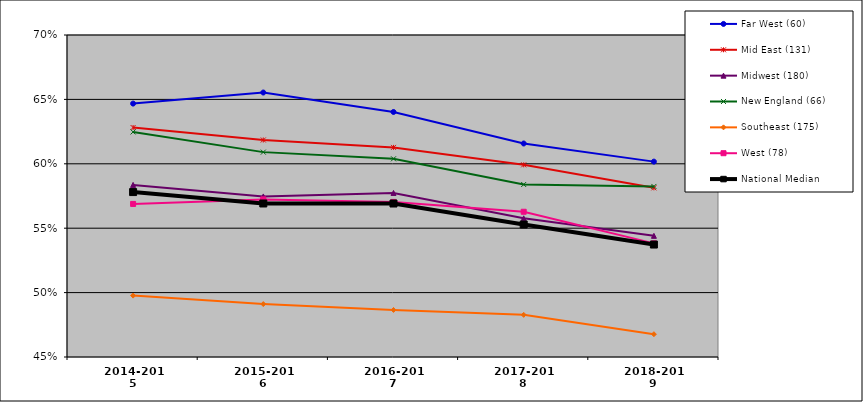
| Category | Far West (60) | Mid East (131) | Midwest (180) | New England (66) | Southeast (175) | West (78) | National Median |
|---|---|---|---|---|---|---|---|
| 2014-2015 | 0.647 | 0.628 | 0.584 | 0.625 | 0.498 | 0.569 | 0.578 |
| 2015-2016 | 0.655 | 0.618 | 0.575 | 0.609 | 0.491 | 0.572 | 0.569 |
| 2016-2017 | 0.64 | 0.613 | 0.577 | 0.604 | 0.487 | 0.57 | 0.569 |
| 2017-2018 | 0.616 | 0.599 | 0.558 | 0.584 | 0.483 | 0.563 | 0.553 |
| 2018-2019 | 0.602 | 0.581 | 0.544 | 0.582 | 0.468 | 0.538 | 0.537 |